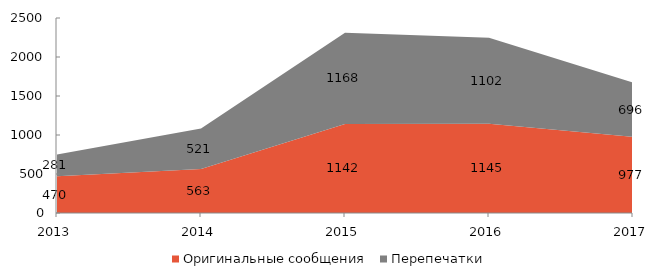
| Category | Оригинальные сообщения | Перепечатки |
|---|---|---|
| 2013 | 470 | 281 |
| 2014 | 563 | 521 |
| 2015 | 1142 | 1168 |
| 2016 | 1145 | 1102 |
| 2017 | 977 | 696 |